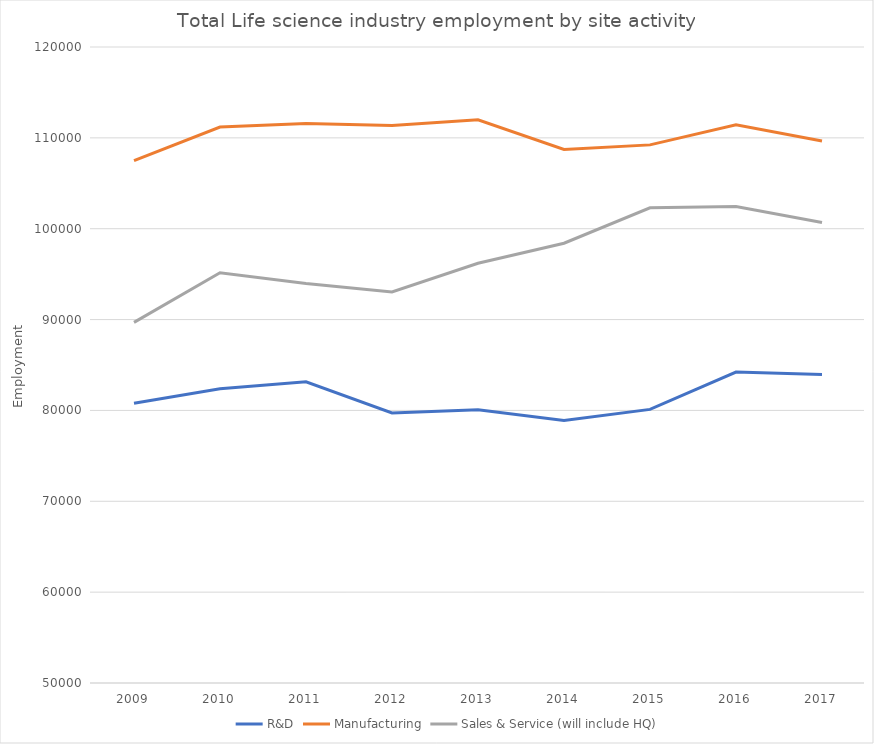
| Category | R&D | Manufacturing | Sales & Service (will include HQ) |
|---|---|---|---|
| 2009 | 80801 | 107491 | 89688 |
| 2010 | 82381 | 111194 | 95147 |
| 2011 | 83153 | 111578 | 93980 |
| 2012 | 79720 | 111354 | 93046 |
| 2013 | 80082 | 111994 | 96202 |
| 2014 | 78891 | 108720 | 98405 |
| 2015 | 80112 | 109227 | 102295 |
| 2016 | 84221 | 111447 | 102446 |
| 2017 | 83957 | 109651 | 100680 |